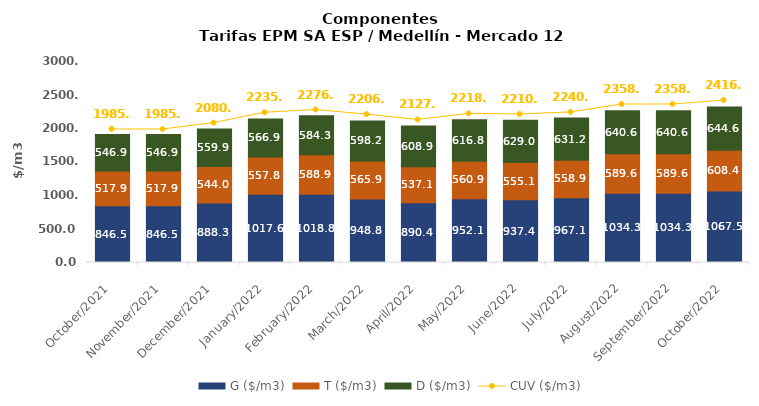
| Category | G ($/m3) | T ($/m3) | D ($/m3) |
|---|---|---|---|
| 2021-10-01 | 846.46 | 517.88 | 546.94 |
| 2021-11-01 | 846.46 | 517.88 | 546.94 |
| 2021-12-01 | 888.25 | 543.96 | 559.88 |
| 2022-01-01 | 1017.59 | 557.8 | 566.91 |
| 2022-02-01 | 1018.83 | 588.88 | 584.28 |
| 2022-03-01 | 948.81 | 565.86 | 598.22 |
| 2022-04-01 | 890.41 | 537.06 | 608.87 |
| 2022-05-01 | 952.08 | 560.91 | 616.84 |
| 2022-06-01 | 937.38 | 555.07 | 629.04 |
| 2022-07-01 | 967.08 | 558.87 | 631.23 |
| 2022-08-01 | 1034.31 | 589.64 | 640.63 |
| 2022-09-01 | 1034.31 | 589.64 | 640.63 |
| 2022-10-01 | 1067.51 | 608.44 | 644.64 |